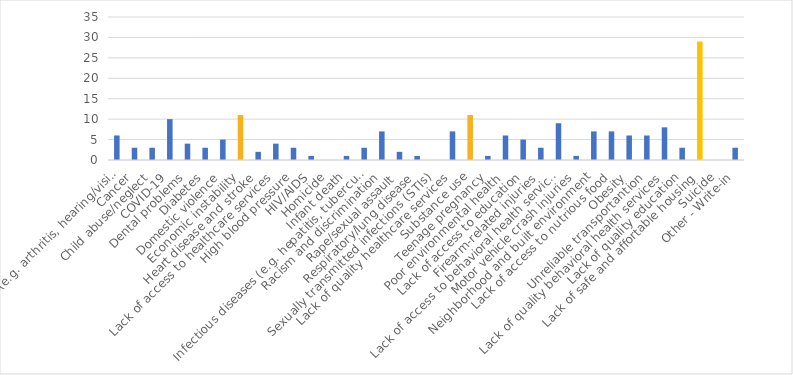
| Category | Number of Responses |
|---|---|
| Aging problems (e.g. arthritis, hearing/vision loss, etc.) | 6 |
| Cancer | 3 |
| Child abuse/neglect | 3 |
| COVID-19 | 10 |
| Dental problems | 4 |
| Diabetes | 3 |
| Domestic violence | 5 |
| Economic instability | 11 |
| Heart disease and stroke | 2 |
| Lack of access to healthcare services | 4 |
| High blood pressure | 3 |
| HIV/AIDS | 1 |
| Homicide | 0 |
| Infant death | 1 |
| Infectious diseases (e.g. hepatitis, tuberculosis, etc.) | 3 |
| Racism and discrimination | 7 |
| Rape/sexual assault | 2 |
| Respiratory/lung disease | 1 |
| Sexually transmitted infections (STIs) | 0 |
| Lack of quality healthcare services | 7 |
| Substance use | 11 |
| Teenage pregnancy | 1 |
| Poor environmental health | 6 |
| Lack of access to education | 5 |
| Firearm-related injuries | 3 |
| Lack of access to behavioral health services | 9 |
| Motor vehicle crash injuries | 1 |
| Neighborhood and built environment | 7 |
| Lack of access to nutrious food | 7 |
| Obesity | 6 |
| Unreliable transportantion | 6 |
| Lack of quality behavioral health services | 8 |
| Lack of quality education | 3 |
| Lack of safe and affortable housing | 29 |
| Suicide | 0 |
| Other - Write-in | 3 |